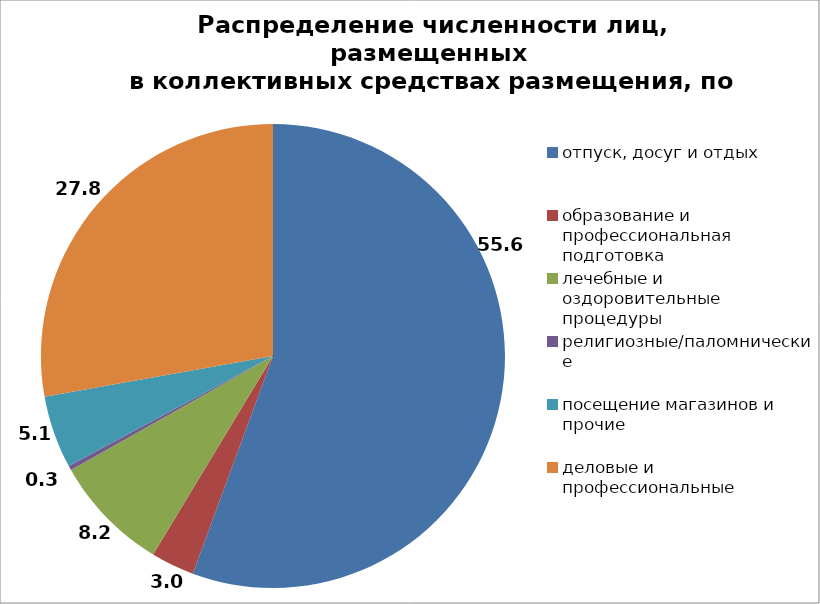
| Category | Series 0 |
|---|---|
| отпуск, досуг и отдых | 55.622 |
| образование и профессиональная  подготовка | 3.022 |
| лечебные и оздоровительные  процедуры | 8.171 |
| религиозные/паломнические  | 0.314 |
| посещение магазинов и прочие | 5.069 |
| деловые и профессиональные | 27.801 |